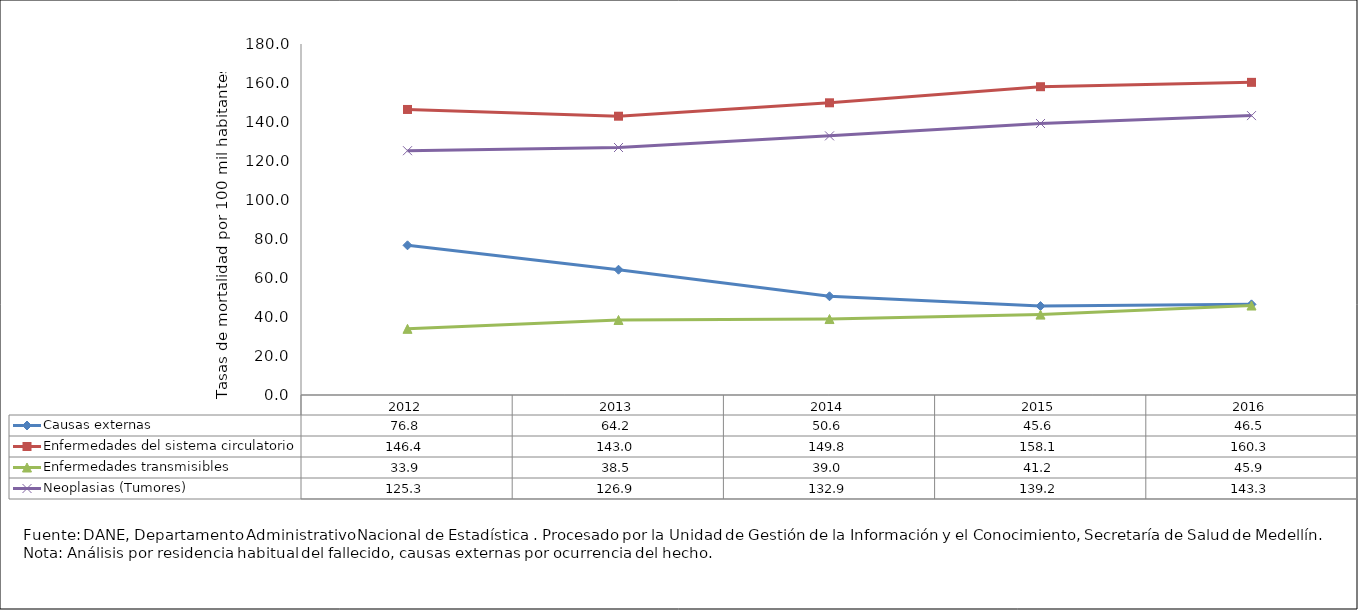
| Category | Causas externas | Enfermedades del sistema circulatorio | Enfermedades transmisibles | Neoplasias (Tumores) |
|---|---|---|---|---|
| 2012.0 | 76.765 | 146.426 | 33.932 | 125.281 |
| 2013.0 | 64.245 | 142.968 | 38.472 | 126.917 |
| 2014.0 | 50.632 | 149.849 | 38.957 | 132.89 |
| 2015.0 | 45.611 | 158.096 | 41.228 | 139.227 |
| 2016.0 | 46.487 | 160.331 | 45.884 | 143.281 |